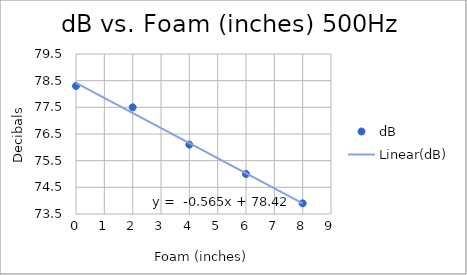
| Category | dB |
|---|---|
| 0.0 | 78.3 |
| 2.0 | 77.5 |
| 4.0 | 76.1 |
| 6.0 | 75 |
| 8.0 | 73.9 |